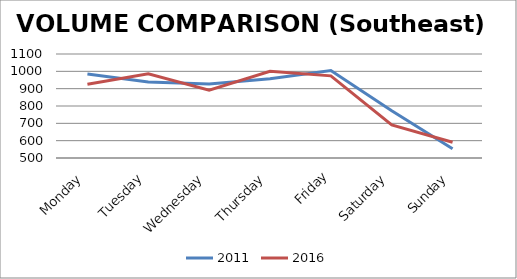
| Category | 2011 | 2016 |
|---|---|---|
| Monday | 984 | 925 |
| Tuesday | 939 | 986 |
| Wednesday | 927 | 891 |
| Thursday | 957 | 1000 |
| Friday | 1005 | 974 |
| Saturday | 772 | 691 |
| Sunday | 553 | 591 |